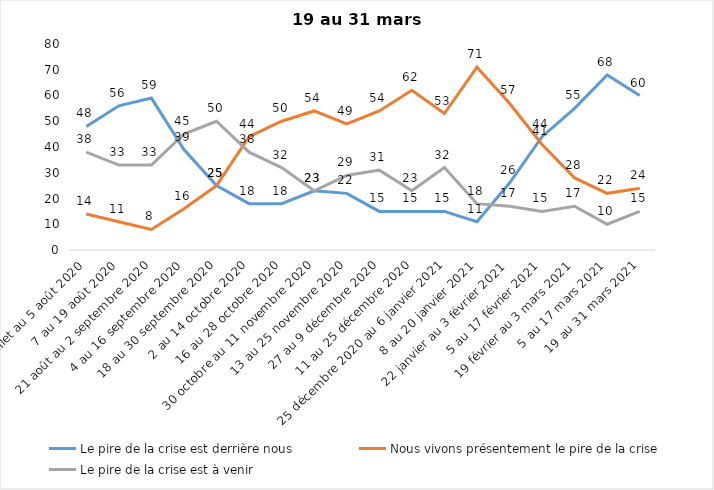
| Category | Le pire de la crise est derrière nous | Nous vivons présentement le pire de la crise | Le pire de la crise est à venir |
|---|---|---|---|
| 24 juillet au 5 août 2020 | 48 | 14 | 38 |
| 7 au 19 août 2020 | 56 | 11 | 33 |
| 21 août au 2 septembre 2020 | 59 | 8 | 33 |
| 4 au 16 septembre 2020 | 39 | 16 | 45 |
| 18 au 30 septembre 2020 | 25 | 25 | 50 |
| 2 au 14 octobre 2020 | 18 | 44 | 38 |
| 16 au 28 octobre 2020 | 18 | 50 | 32 |
| 30 octobre au 11 novembre 2020 | 23 | 54 | 23 |
| 13 au 25 novembre 2020 | 22 | 49 | 29 |
| 27 au 9 décembre 2020 | 15 | 54 | 31 |
| 11 au 25 décembre 2020 | 15 | 62 | 23 |
| 25 décembre 2020 au 6 janvier 2021 | 15 | 53 | 32 |
| 8 au 20 janvier 2021 | 11 | 71 | 18 |
| 22 janvier au 3 février 2021 | 26 | 57 | 17 |
| 5 au 17 février 2021 | 44 | 41 | 15 |
| 19 février au 3 mars 2021 | 55 | 28 | 17 |
| 5 au 17 mars 2021 | 68 | 22 | 10 |
| 19 au 31 mars 2021 | 60 | 24 | 15 |